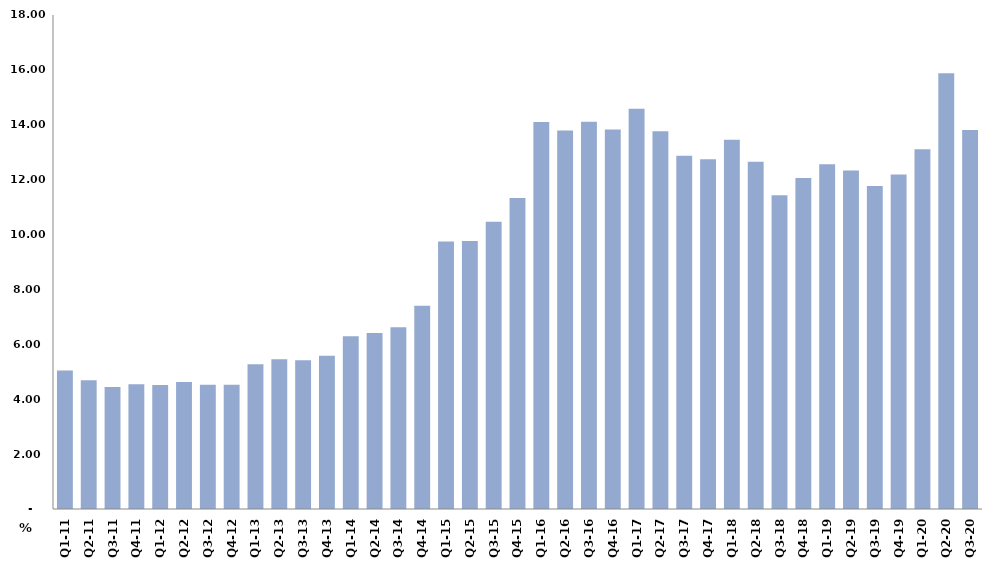
| Category | النسبة المئوية من الناتج المحلي الاجمالي
Percent of Total GDP |
|---|---|
| Q1-11 | 5.046 |
| Q2-11 | 4.688 |
| Q3-11 | 4.448 |
| Q4-11 | 4.546 |
| Q1-12 | 4.519 |
| Q2-12 | 4.63 |
| Q3-12 | 4.524 |
| Q4-12 | 4.531 |
| Q1-13 | 5.273 |
| Q2-13 | 5.46 |
| Q3-13 | 5.416 |
| Q4-13 | 5.586 |
| Q1-14 | 6.291 |
| Q2-14 | 6.417 |
| Q3-14 | 6.619 |
| Q4-14 | 7.402 |
| Q1-15 | 9.743 |
| Q2-15 | 9.763 |
| Q3-15 | 10.463 |
| Q4-15 | 11.334 |
| Q1-16 | 14.103 |
| Q2-16 | 13.793 |
| Q3-16 | 14.108 |
| Q4-16 | 13.826 |
| Q1-17 | 14.585 |
| Q2-17 | 13.768 |
| Q3-17 | 12.871 |
| Q4-17 | 12.74 |
| Q1-18 | 13.457 |
| Q2-18 | 12.65 |
| Q3-18 | 11.428 |
| Q4-18 | 12.065 |
| Q1-19 | 12.558 |
| Q2-19 | 12.331 |
| Q3-19 | 11.772 |
| Q4-19 | 12.189 |
| Q1-20 | 13.107 |
| Q2-20 | 15.876 |
| Q3-20 | 13.811 |